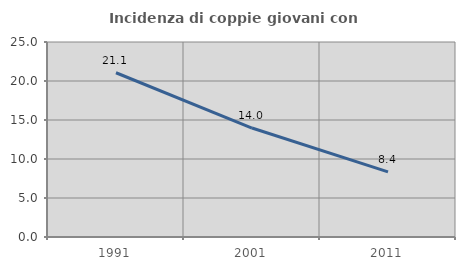
| Category | Incidenza di coppie giovani con figli |
|---|---|
| 1991.0 | 21.058 |
| 2001.0 | 13.969 |
| 2011.0 | 8.352 |